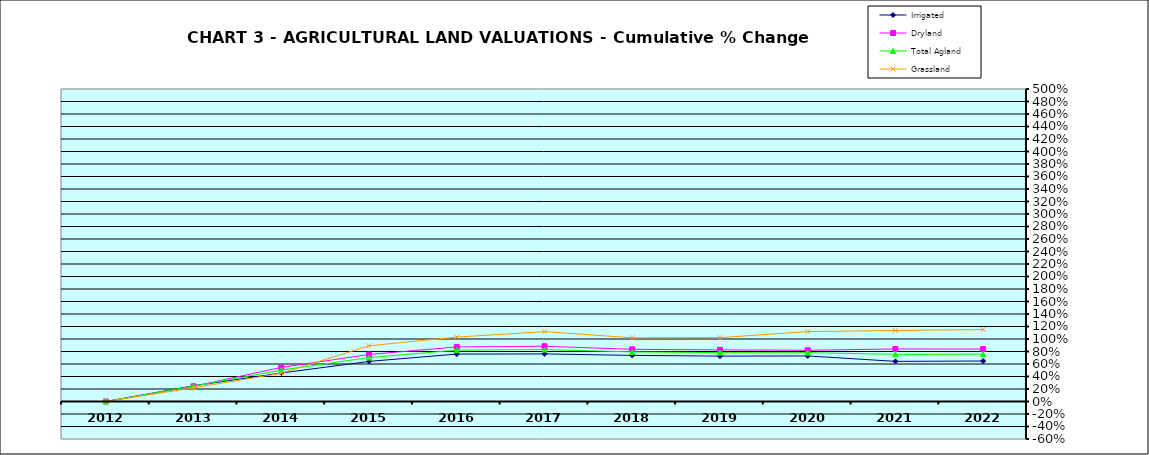
| Category | Irrigated | Dryland | Total Agland | Grassland |
|---|---|---|---|---|
| 2012.0 | 0 | 0 | 0 | 0 |
| 2013.0 | 0.252 | 0.243 | 0.246 | 0.219 |
| 2014.0 | 0.456 | 0.546 | 0.502 | 0.453 |
| 2015.0 | 0.641 | 0.752 | 0.703 | 0.891 |
| 2016.0 | 0.759 | 0.873 | 0.822 | 1.031 |
| 2017.0 | 0.761 | 0.884 | 0.831 | 1.118 |
| 2018.0 | 0.738 | 0.835 | 0.793 | 1.02 |
| 2019.0 | 0.726 | 0.826 | 0.782 | 1.022 |
| 2020.0 | 0.729 | 0.819 | 0.782 | 1.119 |
| 2021.0 | 0.642 | 0.84 | 0.755 | 1.136 |
| 2022.0 | 0.648 | 0.839 | 0.757 | 1.152 |